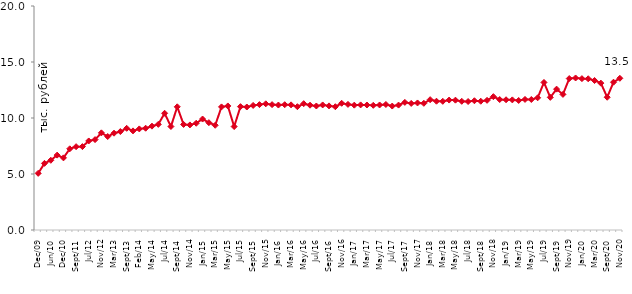
| Category | медианное значение среднедушевого располагаемого дохода, тыс. руб. |
|---|---|
| 2009-12-01 | 5.058 |
| 2010-04-01 | 5.949 |
| 2010-06-01 | 6.224 |
| 2010-09-01 | 6.686 |
| 2010-12-01 | 6.44 |
| 2011-07-01 | 7.25 |
| 2011-09-01 | 7.441 |
| 2011-12-01 | 7.446 |
| 2012-07-01 | 7.95 |
| 2012-09-01 | 8.071 |
| 2012-11-01 | 8.673 |
| 2012-12-01 | 8.345 |
| 2013-03-01 | 8.644 |
| 2013-06-01 | 8.789 |
| 2013-09-01 | 9.079 |
| 2013-12-01 | 8.849 |
| 2014-02-01 | 9.025 |
| 2014-04-01 | 9.087 |
| 2014-05-01 | 9.273 |
| 2014-06-01 | 9.432 |
| 2014-07-01 | 10.422 |
| 2014-08-01 | 9.241 |
| 2014-09-01 | 11 |
| 2014-10-01 | 9.426 |
| 2014-11-01 | 9.381 |
| 2014-12-01 | 9.532 |
| 2015-01-01 | 9.908 |
| 2015-02-01 | 9.585 |
| 2015-03-01 | 9.35 |
| 2015-04-01 | 10.991 |
| 2015-05-01 | 11.076 |
| 2015-06-01 | 9.237 |
| 2015-07-01 | 11.013 |
| 2015-08-01 | 10.981 |
| 2015-09-01 | 11.124 |
| 2015-10-01 | 11.195 |
| 2015-11-01 | 11.268 |
| 2015-12-01 | 11.194 |
| 2016-01-01 | 11.158 |
| 2016-02-01 | 11.188 |
| 2016-03-01 | 11.174 |
| 2016-04-01 | 11.01 |
| 2016-05-01 | 11.278 |
| 2016-06-01 | 11.142 |
| 2016-07-01 | 11.072 |
| 2016-08-01 | 11.165 |
| 2016-09-01 | 11.082 |
| 2016-10-01 | 11.008 |
| 2016-11-01 | 11.313 |
| 2016-12-01 | 11.216 |
| 2017-01-01 | 11.146 |
| 2017-02-01 | 11.17 |
| 2017-03-01 | 11.162 |
| 2017-04-01 | 11.133 |
| 2017-05-01 | 11.163 |
| 2017-06-01 | 11.207 |
| 2017-07-01 | 11.066 |
| 2017-08-01 | 11.153 |
| 2017-09-01 | 11.395 |
| 2017-10-01 | 11.301 |
| 2017-11-01 | 11.342 |
| 2017-12-01 | 11.31 |
| 2018-01-01 | 11.637 |
| 2018-02-01 | 11.497 |
| 2018-03-01 | 11.49 |
| 2018-04-01 | 11.601 |
| 2018-05-01 | 11.592 |
| 2018-06-01 | 11.491 |
| 2018-07-01 | 11.471 |
| 2018-08-01 | 11.541 |
| 2018-09-01 | 11.497 |
| 2018-10-01 | 11.578 |
| 2018-11-01 | 11.906 |
| 2018-12-01 | 11.648 |
| 2019-01-01 | 11.629 |
| 2019-02-01 | 11.617 |
| 2019-03-01 | 11.566 |
| 2019-04-01 | 11.659 |
| 2019-05-01 | 11.653 |
| 2019-06-01 | 11.805 |
| 2019-07-01 | 13.174 |
| 2019-08-01 | 11.844 |
| 2019-09-01 | 12.577 |
| 2019-10-01 | 12.107 |
| 2019-11-01 | 13.523 |
| 2019-12-01 | 13.573 |
| 2020-01-01 | 13.516 |
| 2020-02-01 | 13.502 |
| 2020-03-01 | 13.349 |
| 2020-08-01 | 13.113 |
| 2020-09-01 | 11.853 |
| 2020-10-01 | 13.196 |
| 2020-11-01 | 13.544 |